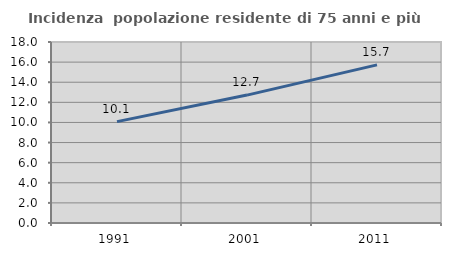
| Category | Incidenza  popolazione residente di 75 anni e più |
|---|---|
| 1991.0 | 10.083 |
| 2001.0 | 12.72 |
| 2011.0 | 15.722 |